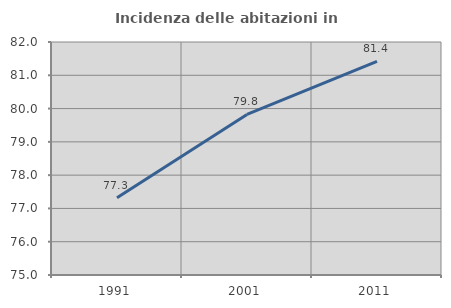
| Category | Incidenza delle abitazioni in proprietà  |
|---|---|
| 1991.0 | 77.32 |
| 2001.0 | 79.823 |
| 2011.0 | 81.419 |